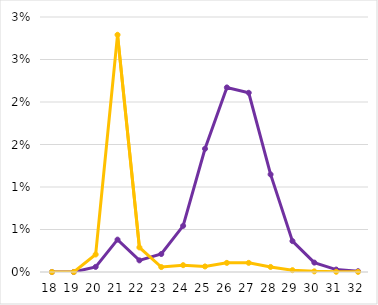
| Category | TE | Virus |
|---|---|---|
| 18.0 | 0 | 0 |
| 19.0 | 0 | 0 |
| 20.0 | 0.001 | 0.002 |
| 21.0 | 0.004 | 0.028 |
| 22.0 | 0.001 | 0.003 |
| 23.0 | 0.002 | 0.001 |
| 24.0 | 0.005 | 0.001 |
| 25.0 | 0.014 | 0.001 |
| 26.0 | 0.022 | 0.001 |
| 27.0 | 0.021 | 0.001 |
| 28.0 | 0.011 | 0.001 |
| 29.0 | 0.004 | 0 |
| 30.0 | 0.001 | 0 |
| 31.0 | 0 | 0 |
| 32.0 | 0 | 0 |